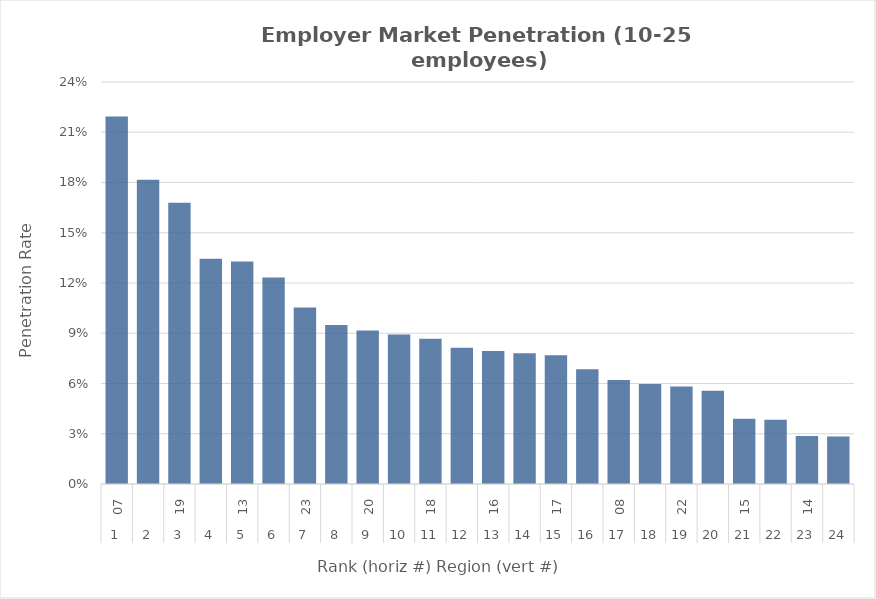
| Category | Rate |
|---|---|
| 0 | 0.219 |
| 1 | 0.182 |
| 2 | 0.168 |
| 3 | 0.134 |
| 4 | 0.133 |
| 5 | 0.123 |
| 6 | 0.105 |
| 7 | 0.095 |
| 8 | 0.092 |
| 9 | 0.089 |
| 10 | 0.087 |
| 11 | 0.081 |
| 12 | 0.079 |
| 13 | 0.078 |
| 14 | 0.077 |
| 15 | 0.068 |
| 16 | 0.062 |
| 17 | 0.06 |
| 18 | 0.058 |
| 19 | 0.056 |
| 20 | 0.039 |
| 21 | 0.038 |
| 22 | 0.029 |
| 23 | 0.028 |